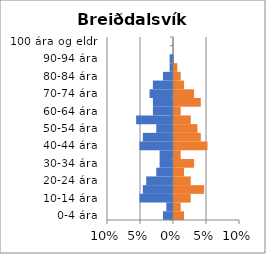
| Category | % karlar | %konur |
|---|---|---|
| 0-4 ára | -0.015 | 0.015 |
| 5-9 ára | -0.01 | 0.01 |
| 10-14 ára | -0.051 | 0.025 |
| 15-19 ára | -0.046 | 0.046 |
| 20-24 ára | -0.041 | 0.025 |
| 25-29 ára | -0.025 | 0.015 |
| 30-34 ára | -0.02 | 0.03 |
| 35-39 ára | -0.02 | 0.01 |
| 40-44 ára | -0.051 | 0.051 |
| 45-49 ára | -0.046 | 0.041 |
| 50-54 ára | -0.025 | 0.036 |
| 55-59 ára | -0.056 | 0.025 |
| 60-64 ára | -0.03 | 0.01 |
| 65-69 ára | -0.03 | 0.041 |
| 70-74 ára | -0.036 | 0.03 |
| 75-79 ára | -0.03 | 0.015 |
| 80-84 ára | -0.015 | 0.01 |
| 85-89 ára | -0.005 | 0.005 |
| 90-94 ára | -0.005 | 0 |
| 95-99 ára | 0 | 0 |
| 100 ára og eldri | 0 | 0 |